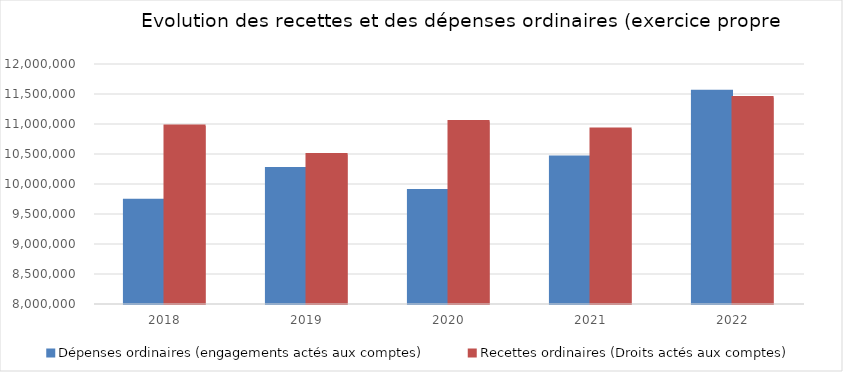
| Category | Dépenses ordinaires (engagements actés aux comptes) | Recettes ordinaires (Droits actés aux comptes) |
|---|---|---|
| 2018.0 | 9727236.52 | 10965009.04 |
| 2019.0 | 10260387.9 | 10489960.39 |
| 2020.0 | 9890549.07 | 11039996.93 |
| 2021.0 | 10447973.93 | 10916314.94 |
| 2022.0 | 11545466 | 11443323.56 |